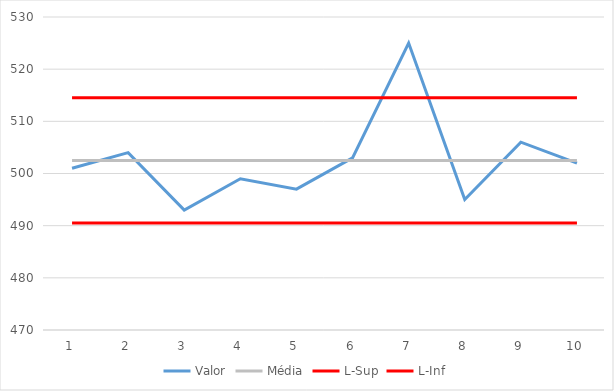
| Category | Valor | Média | L-Sup | L-Inf |
|---|---|---|---|---|
| 0 | 501 | 502.5 | 514.5 | 490.5 |
| 1 | 504 | 502.5 | 514.5 | 490.5 |
| 2 | 493 | 502.5 | 514.5 | 490.5 |
| 3 | 499 | 502.5 | 514.5 | 490.5 |
| 4 | 497 | 502.5 | 514.5 | 490.5 |
| 5 | 503 | 502.5 | 514.5 | 490.5 |
| 6 | 525 | 502.5 | 514.5 | 490.5 |
| 7 | 495 | 502.5 | 514.5 | 490.5 |
| 8 | 506 | 502.5 | 514.5 | 490.5 |
| 9 | 502 | 502.5 | 514.5 | 490.5 |